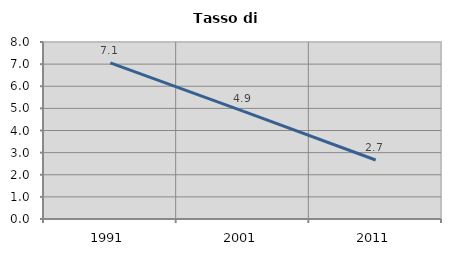
| Category | Tasso di disoccupazione   |
|---|---|
| 1991.0 | 7.059 |
| 2001.0 | 4.878 |
| 2011.0 | 2.667 |